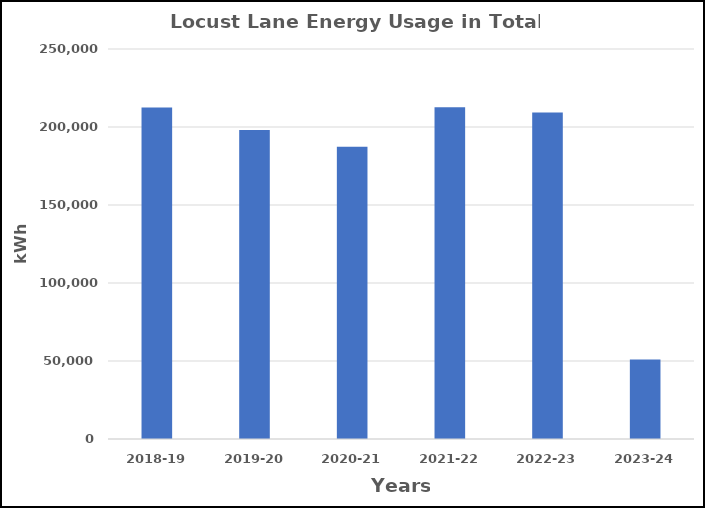
| Category | Series 0 |
|---|---|
| 2018-19 | 212571 |
| 2019-20 | 198071 |
| 2020-21 | 187304 |
| 2021-22 | 212710 |
| 2022-23 | 209316 |
| 2023-24 | 50936 |